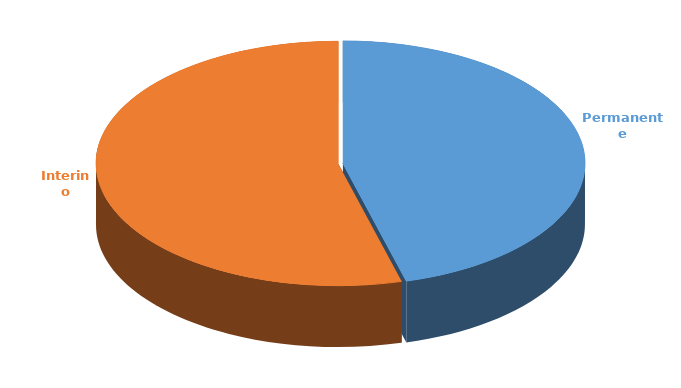
| Category | Cantidad |
|---|---|
| Permanente | 2807 |
| Interino | 3325 |